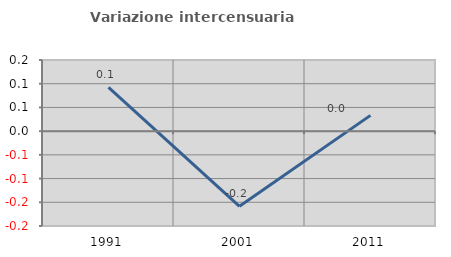
| Category | Variazione intercensuaria annua |
|---|---|
| 1991.0 | 0.092 |
| 2001.0 | -0.159 |
| 2011.0 | 0.033 |